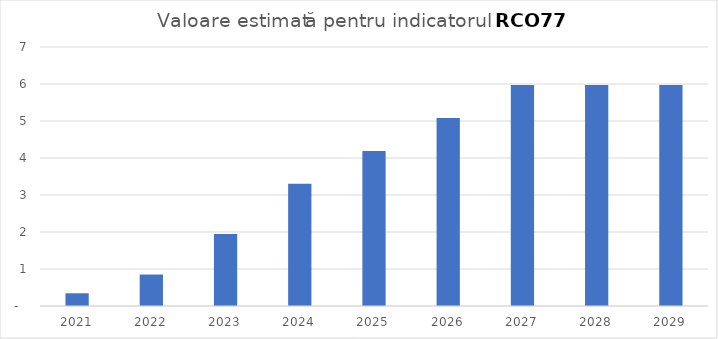
| Category | Series 0 |
|---|---|
| 2021.0 | 0.344 |
| 2022.0 | 0.851 |
| 2023.0 | 1.944 |
| 2024.0 | 3.301 |
| 2025.0 | 4.193 |
| 2026.0 | 5.084 |
| 2027.0 | 5.975 |
| 2028.0 | 5.975 |
| 2029.0 | 5.975 |